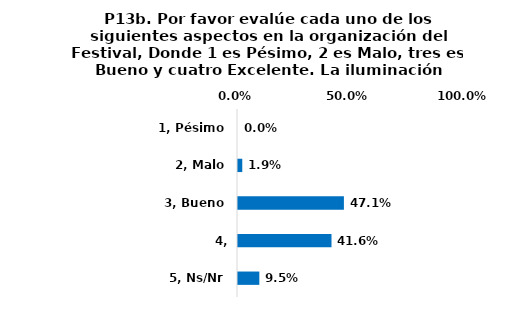
| Category | Series 0 |
|---|---|
| 1, Pésimo | 0 |
| 2, Malo | 0.019 |
| 3, Bueno | 0.471 |
| 4, Excelente | 0.416 |
| 5, Ns/Nr | 0.095 |